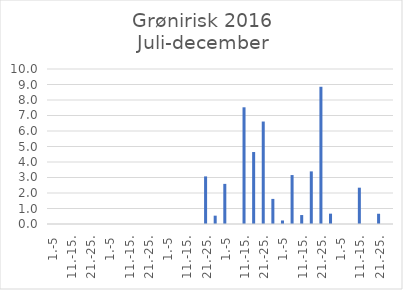
| Category | Series 0 |
|---|---|
| 1.-5 | 0 |
| 6.-10. | 0 |
| 11.-15. | 0 |
| 16.-20. | 0 |
| 21.-25. | 0 |
| 26.-31. | 0 |
| 1.-5 | 0 |
| 6.-10. | 0 |
| 11.-15. | 0 |
| 16.-20. | 0 |
| 21.-25. | 0 |
| 26.-31. | 0 |
| 1.-5 | 0 |
| 6.-10. | 0 |
| 11.-15. | 0 |
| 16.-20. | 0 |
| 21.-25. | 3.071 |
| 26.-30. | 0.538 |
| 1.-5 | 2.588 |
| 6.-10. | 0 |
| 11.-15. | 7.529 |
| 16.-20. | 4.643 |
| 21.-25. | 6.611 |
| 26.-31. | 1.619 |
| 1.-5 | 0.229 |
| 6.-10. | 3.158 |
| 11.-15. | 0.577 |
| 16.-20. | 3.394 |
| 21.-25. | 8.854 |
| 26.-30. | 0.667 |
| 1.-5 | 0 |
| 6.-10. | 0 |
| 11.-15. | 2.343 |
| 16.-20. | 0 |
| 21.-25. | 0.661 |
| 26.-31. | 0 |